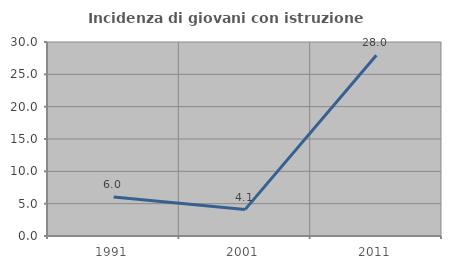
| Category | Incidenza di giovani con istruzione universitaria |
|---|---|
| 1991.0 | 6.024 |
| 2001.0 | 4.082 |
| 2011.0 | 27.957 |